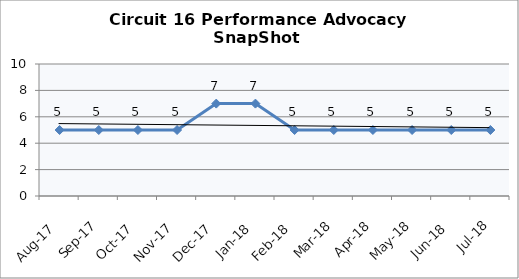
| Category | Circuit 16 |
|---|---|
| Aug-17 | 5 |
| Sep-17 | 5 |
| Oct-17 | 5 |
| Nov-17 | 5 |
| Dec-17 | 7 |
| Jan-18 | 7 |
| Feb-18 | 5 |
| Mar-18 | 5 |
| Apr-18 | 5 |
| May-18 | 5 |
| Jun-18 | 5 |
| Jul-18 | 5 |